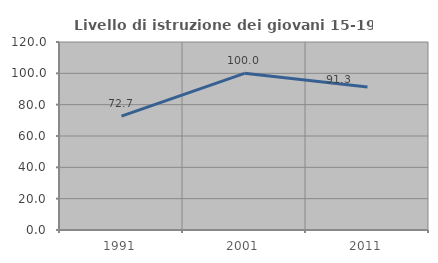
| Category | Livello di istruzione dei giovani 15-19 anni |
|---|---|
| 1991.0 | 72.727 |
| 2001.0 | 100 |
| 2011.0 | 91.304 |